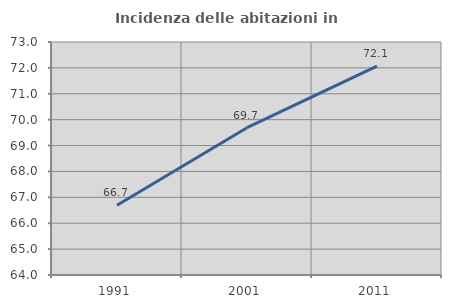
| Category | Incidenza delle abitazioni in proprietà  |
|---|---|
| 1991.0 | 66.695 |
| 2001.0 | 69.69 |
| 2011.0 | 72.065 |